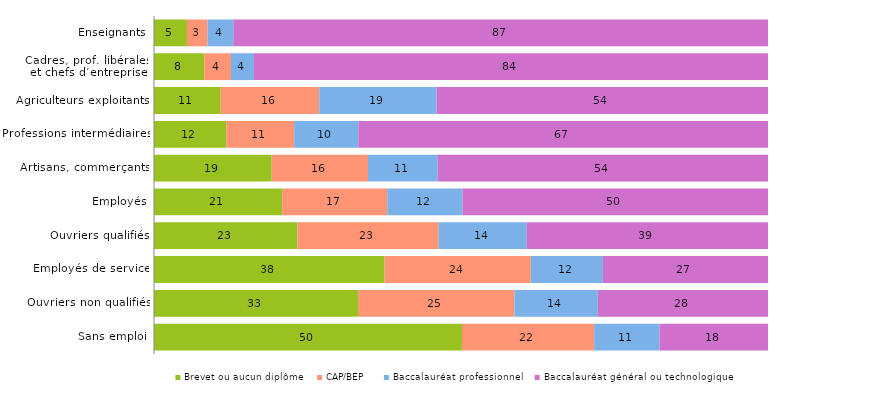
| Category | Brevet ou aucun diplôme | CAP/BEP | Baccalauréat professionnel | Baccalauréat général ou technologique |
|---|---|---|---|---|
| Enseignants | 5.37 | 3.36 | 4.19 | 87.08 |
| Cadres, prof. libérales
 et chefs d’entreprise | 8.21 | 4.32 | 3.75 | 83.72 |
| Agriculteurs exploitants | 10.87 | 16.04 | 19.12 | 53.97 |
| Professions intermédiaires | 11.77 | 11.06 | 10.44 | 66.73 |
| Artisans, commerçants | 19.17 | 15.68 | 11.36 | 53.79 |
| Employés | 20.87 | 17.12 | 12.26 | 49.75 |
| Ouvriers qualifiés | 23.35 | 23.02 | 14.35 | 39.28 |
| Employés de service | 37.54 | 23.83 | 11.74 | 26.88 |
| Ouvriers non qualifiés | 33.24 | 25.46 | 13.58 | 27.72 |
| Sans emploi | 50.16 | 21.53 | 10.65 | 17.66 |